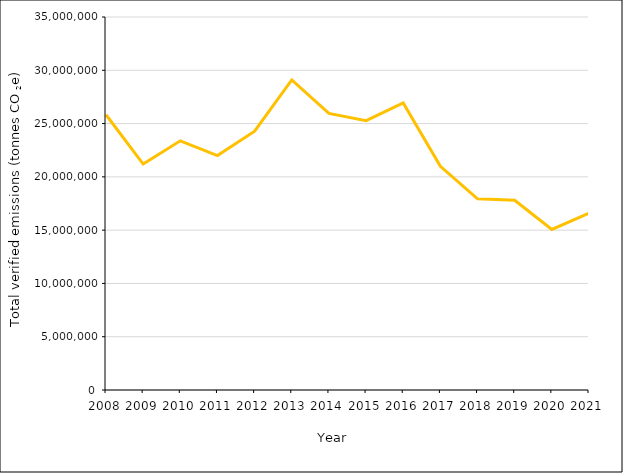
| Category | Total verified emissions (tonnes CO₂e) |
|---|---|
| 2008.0 | 25829006 |
| 2009.0 | 21197140 |
| 2010.0 | 23380398 |
| 2011.0 | 21999216 |
| 2012.0 | 24285670 |
| 2013.0 | 29100041 |
| 2014.0 | 25958667 |
| 2015.0 | 25274427 |
| 2016.0 | 26928604 |
| 2017.0 | 20985418 |
| 2018.0 | 17942480 |
| 2019.0 | 17801941 |
| 2020.0 | 15066250 |
| 2021.0 | 16587156 |